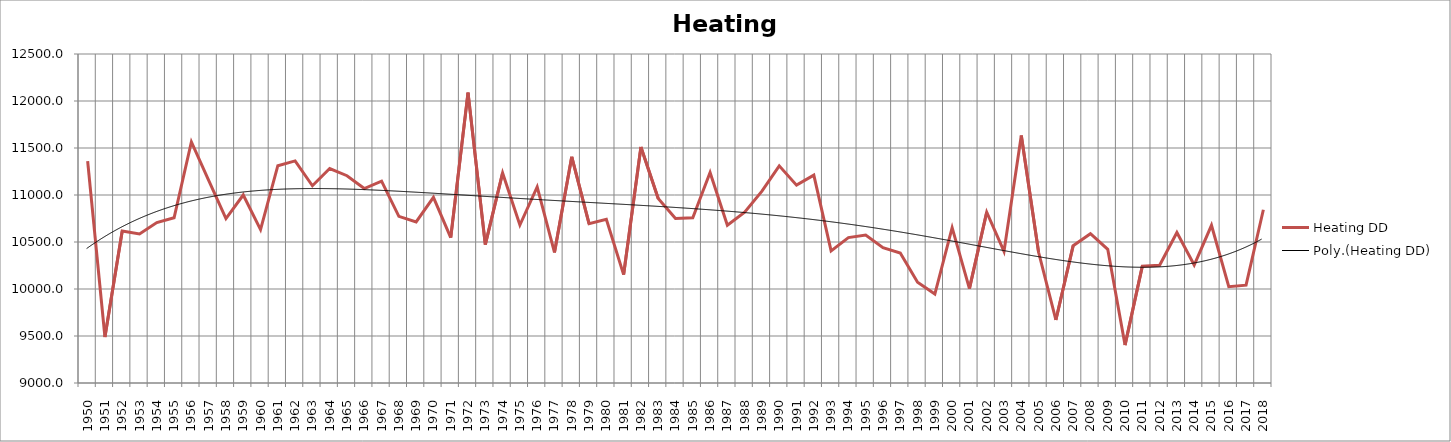
| Category | Heating DD |
|---|---|
| 1950.0 | 11360.4 |
| 1951.0 | 9488.7 |
| 1952.0 | 10616 |
| 1953.0 | 10585.2 |
| 1954.0 | 10706.4 |
| 1955.0 | 10757.6 |
| 1956.0 | 11564.6 |
| 1957.0 | 11154.4 |
| 1958.0 | 10749.7 |
| 1959.0 | 11000.1 |
| 1960.0 | 10631.8 |
| 1961.0 | 11311.6 |
| 1962.0 | 11362.6 |
| 1963.0 | 11098.2 |
| 1964.0 | 11281.4 |
| 1965.0 | 11204.9 |
| 1966.0 | 11068.5 |
| 1967.0 | 11147.4 |
| 1968.0 | 10773.2 |
| 1969.0 | 10714.1 |
| 1970.0 | 10975.7 |
| 1971.0 | 10546.5 |
| 1972.0 | 12088.5 |
| 1973.0 | 10471.3 |
| 1974.0 | 11234.5 |
| 1975.0 | 10680.8 |
| 1976.0 | 11085.7 |
| 1977.0 | 10389.4 |
| 1978.0 | 11406.1 |
| 1979.0 | 10695.6 |
| 1980.0 | 10742.5 |
| 1981.0 | 10153.1 |
| 1982.0 | 11511.1 |
| 1983.0 | 10963.1 |
| 1984.0 | 10751.1 |
| 1985.0 | 10756.8 |
| 1986.0 | 11239.5 |
| 1987.0 | 10678.5 |
| 1988.0 | 10816.8 |
| 1989.0 | 11040.5 |
| 1990.0 | 11310.1 |
| 1991.0 | 11104.9 |
| 1992.0 | 11211.4 |
| 1993.0 | 10405.7 |
| 1994.0 | 10547 |
| 1995.0 | 10574.6 |
| 1996.0 | 10438.9 |
| 1997.0 | 10383.3 |
| 1998.0 | 10071.3 |
| 1999.0 | 9945.8 |
| 2000.0 | 10653.1 |
| 2001.0 | 10003.3 |
| 2002.0 | 10817.4 |
| 2003.0 | 10400.2 |
| 2004.0 | 11633.5 |
| 2005.0 | 10390.7 |
| 2006.0 | 9670.5 |
| 2007.0 | 10461 |
| 2008.0 | 10588.1 |
| 2009.0 | 10422.6 |
| 2010.0 | 9403.3 |
| 2011.0 | 10243.1 |
| 2012.0 | 10252.9 |
| 2013.0 | 10600.9 |
| 2014.0 | 10255.3 |
| 2015.0 | 10677.8 |
| 2016.0 | 10024.3 |
| 2017.0 | 10040.6 |
| 2018.0 | 10842.9 |